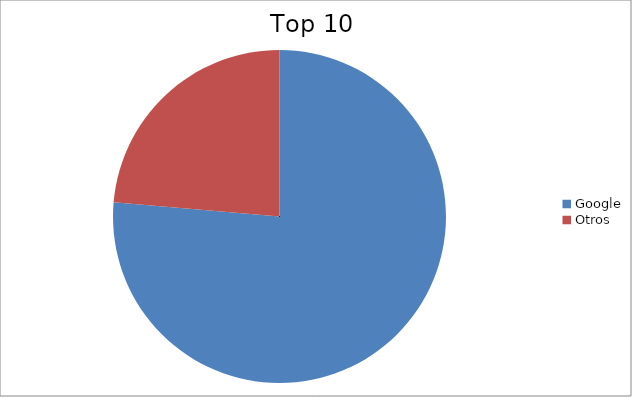
| Category | Series 0 |
|---|---|
| Google | 76.36 |
| Otros | 23.64 |